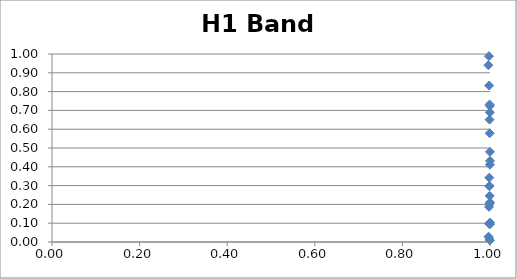
| Category | H1 Band 5 |
|---|---|
| 0.996345023391927 | 0.94 |
| 0.9966860274163801 | 0.028 |
| 0.9975934788620632 | 0.989 |
| 0.997868850619734 | 0.187 |
| 0.9979730335775508 | 0.097 |
| 0.9981215458329364 | 0.832 |
| 0.9982251379502641 | 0.297 |
| 0.9983639518012494 | 0.342 |
| 0.9988704155825419 | 0.016 |
| 0.9989806363563407 | 0.651 |
| 0.9990566084614958 | 0.732 |
| 0.9991571061250489 | 0.202 |
| 0.9991904133426093 | 0.298 |
| 0.9992222028055951 | 0.246 |
| 0.9993753161612969 | 0.578 |
| 0.9997099155217073 | 0.724 |
| 0.9997288237949229 | 0.69 |
| 0.9997571618575032 | 0.008 |
| 0.9998158263335495 | 0.211 |
| 0.9998312240720673 | 0.48 |
| 0.9998721202314399 | 0.411 |
| 0.9999827085639968 | 0.103 |
| 0.9999975475486039 | 0.432 |
| 0.9999999862781035 | 0.095 |